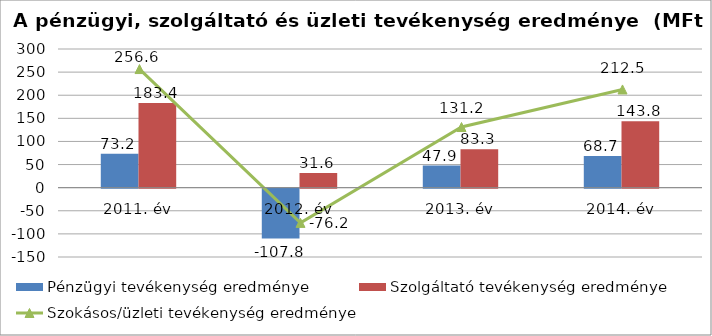
| Category | Pénzügyi tevékenység eredménye | Szolgáltató tevékenység eredménye |
|---|---|---|
| 2011. év | 73.2 | 183.4 |
| 2012. év | -107.8 | 31.6 |
| 2013. év | 47.9 | 83.3 |
| 2014. év | 68.7 | 143.8 |